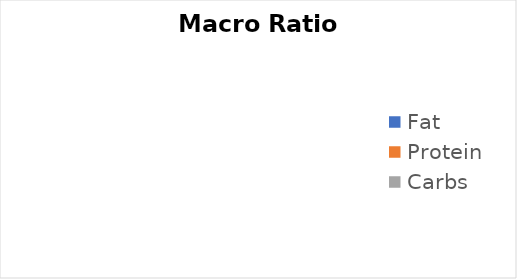
| Category | Series 0 |
|---|---|
| Fat | 0 |
| Protein | 0 |
| Carbs | 0 |